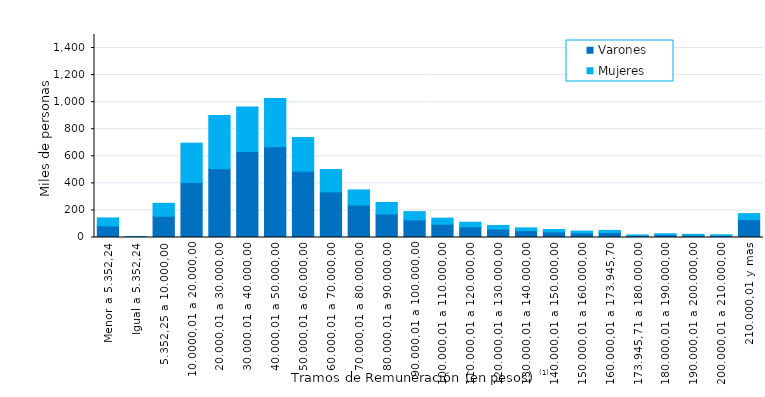
| Category | Varones | Mujeres |
|---|---|---|
| Menor a 5.352,24 | 85298 | 58966 |
| Igual a 5.352,24 | 5535 | 2516 |
| 5.352,25 a 10.000,00 | 156988 | 95627 |
| 10.0000,01 a 20.000,00 | 406836 | 290320 |
| 20.000,01 a 30.000,00 | 508446 | 392403 |
| 30.000.01 a 40.000,00 | 635132 | 329281 |
| 40.000,01 a 50.000,00 | 669961 | 357946 |
| 50.000,01 a 60.000,00 | 489938 | 248830 |
| 60.000,01 a 70.000,00 | 337241 | 164933 |
| 70.000,01 a 80.000,00 | 239559 | 111923 |
| 80.000,01 a 90.000,00 | 174355 | 84724 |
| 90.000,01 a 100.000,00 | 129736 | 61438 |
| 100.000,01 a 110.000,00 | 98263 | 45014 |
| 110.000,01 a 120.000,00 | 78328 | 34574 |
| 120.000,01 a 130.000,00 | 61796 | 27155 |
| 130.000,01 a 140.000,00 | 49852 | 21243 |
| 140.000,01 a 150.000,00 | 41447 | 17417 |
| 150.000,01 a 160.000,00 | 33531 | 13750 |
| 160.000,01 a 173.945,70 | 36935 | 15506 |
| 173.945,71 a 180.000,00 | 13596 | 5633 |
| 180.000,01 a 190.000,00 | 19601 | 8112 |
| 190.000,01 a 200.000,00 | 16742 | 6621 |
| 200.000,01 a 210.000,00 | 14252 | 5845 |
| 210.000,01 y mas | 131547 | 44748 |